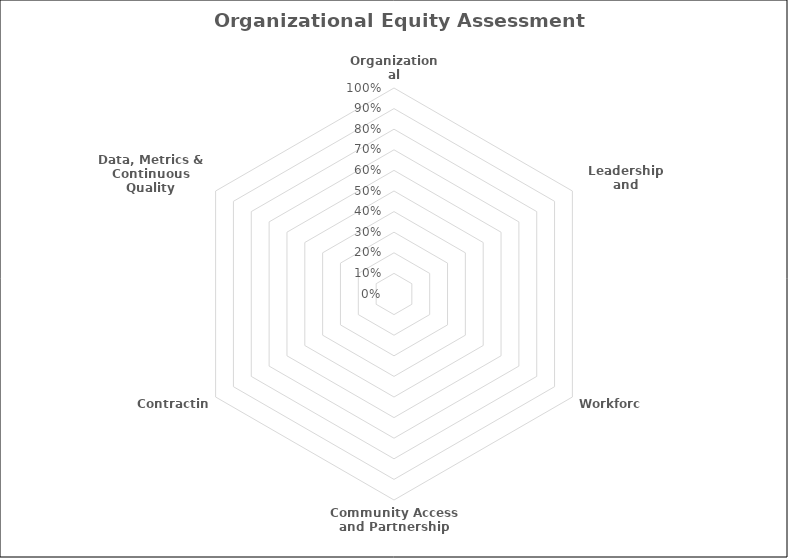
| Category | Series 0 |
|---|---|
| Organizational Commitment | 0 |
| Leadership and Management | 0 |
| Workforce | 0 |
| Community Access and Partnership | 0 |
| Contracting | 0 |
| Data, Metrics & Continuous Quality Improvement | 0 |